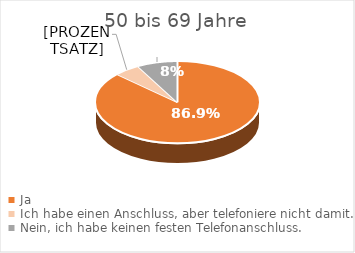
| Category | Series 0 |
|---|---|
| Ja | 86.9 |
| Ich habe einen Anschluss, aber telefoniere nicht damit. | 5.1 |
| Nein, ich habe keinen festen Telefonanschluss. | 8 |